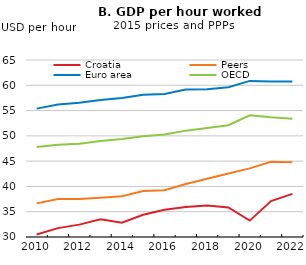
| Category | Croatia | Peers | Euro area | OECD |
|---|---|---|---|---|
| 2010-01-01 | 30.485 | 36.648 | 55.382 | 47.8 |
| 2011-01-01 | 31.754 | 37.527 | 56.215 | 48.233 |
| 2012-01-01 | 32.447 | 37.534 | 56.549 | 48.452 |
| 2013-01-01 | 33.512 | 37.761 | 57.072 | 48.969 |
| 2014-01-01 | 32.817 | 38.072 | 57.494 | 49.37 |
| 2015-01-01 | 34.39 | 39.098 | 58.12 | 49.932 |
| 2016-01-01 | 35.377 | 39.261 | 58.279 | 50.256 |
| 2017-01-01 | 35.921 | 40.489 | 59.158 | 51.033 |
| 2018-01-01 | 36.246 | 41.524 | 59.215 | 51.534 |
| 2019-01-01 | 35.843 | 42.538 | 59.612 | 52.102 |
| 2020-01-01 | 33.238 | 43.57 | 60.868 | 54.054 |
| 2021-01-01 | 37.112 | 44.865 | 60.755 | 53.658 |
| 2022-01-01 | 38.519 | 44.792 | 60.742 | 53.375 |